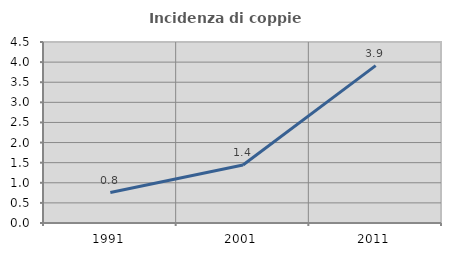
| Category | Incidenza di coppie miste |
|---|---|
| 1991.0 | 0.757 |
| 2001.0 | 1.442 |
| 2011.0 | 3.912 |